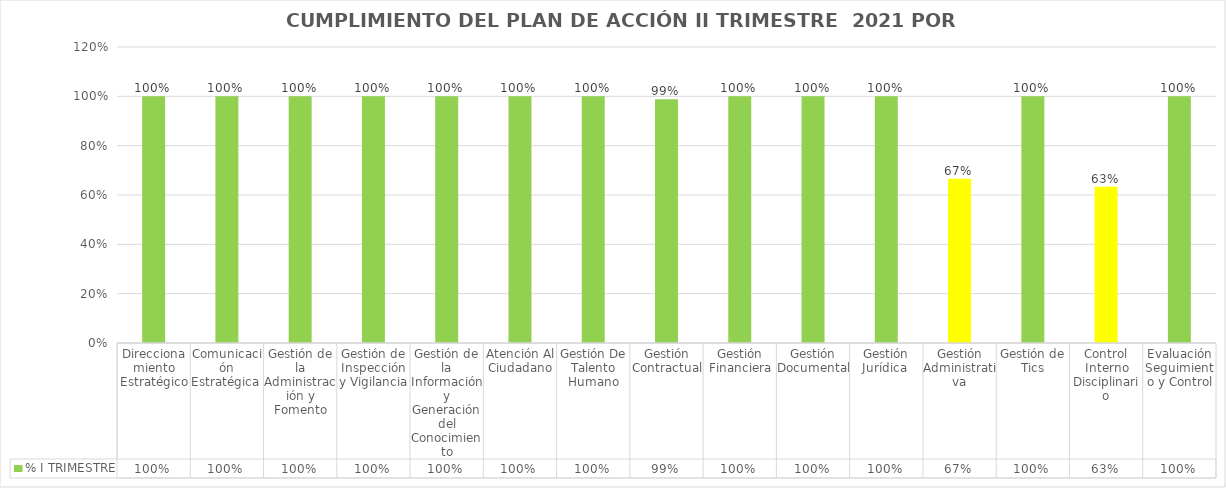
| Category | % I TRIMESTRE |
|---|---|
| Direccionamiento Estratégico | 1 |
| Comunicación Estratégica  | 1 |
| Gestión de la Administración y Fomento | 1 |
| Gestión de Inspección y Vigilancia | 1 |
| Gestión de la Información y Generación del Conocimiento | 1 |
| Atención Al Ciudadano | 1 |
| Gestión De Talento Humano | 1 |
| Gestión Contractual | 0.989 |
| Gestión Financiera | 1 |
| Gestión Documental | 1 |
| Gestión Jurídica  | 1 |
| Gestión Administrativa | 0.666 |
| Gestión de Tics | 1 |
| Control Interno Disciplinario | 0.633 |
| Evaluación Seguimiento y Control | 1 |